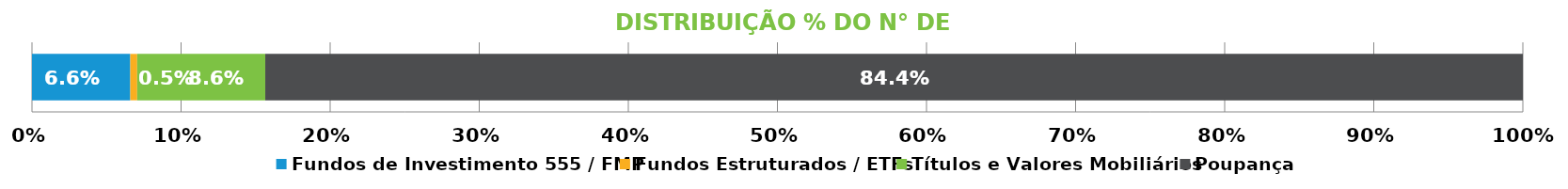
| Category | Fundos de Investimento 555 / FMP | Fundos Estruturados / ETFs | Títulos e Valores Mobiliários | Poupança |
|---|---|---|---|---|
| 0 | 0.066 | 0.005 | 0.086 | 0.844 |